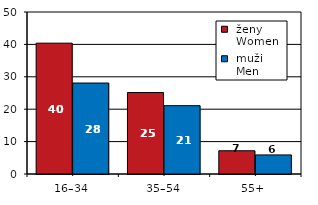
| Category |  ženy 
 Women |  muži 
 Men |
|---|---|---|
| 16–34 | 40.381 | 28.076 |
| 35–54 | 25.141 | 21.085 |
| 55+  | 7.176 | 5.89 |